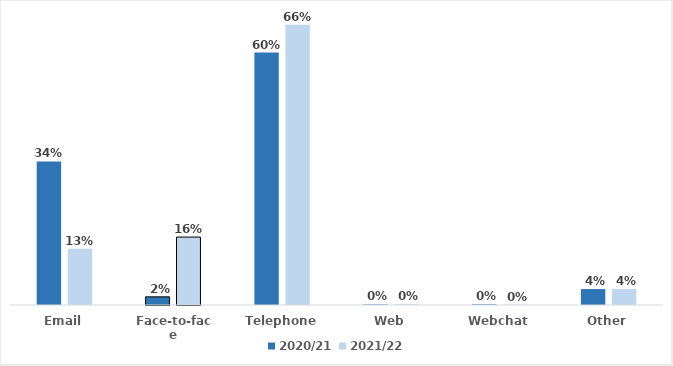
| Category | 2020/21 | 2021/22 |
|---|---|---|
| Email | 0.341 | 0.133 |
| Face-to-face | 0.019 | 0.161 |
| Telephone | 0.599 | 0.665 |
| Web | 0.001 | 0.002 |
| Webchat | 0.002 | 0.001 |
| Other | 0.038 | 0.038 |